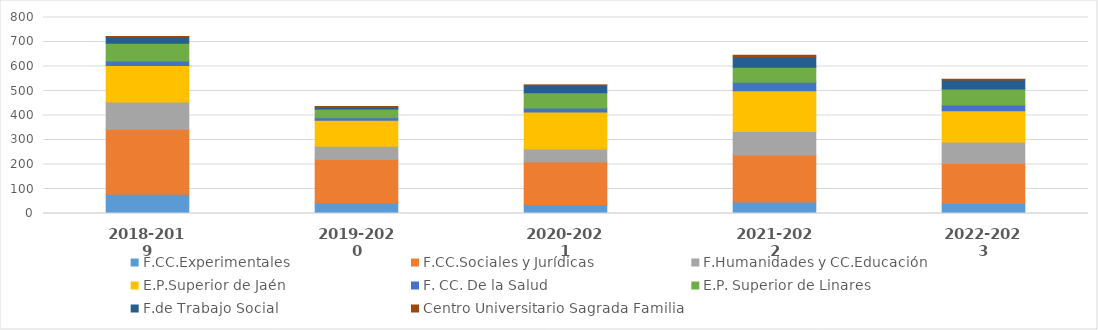
| Category | F.CC.Experimentales | F.CC.Sociales y Jurídicas | F.Humanidades y CC.Educación | E.P.Superior de Jaén | F. CC. De la Salud | E.P. Superior de Linares | F.de Trabajo Social | Centro Universitario Sagrada Familia |
|---|---|---|---|---|---|---|---|---|
| 2018-2019 | 79 | 265 | 111 | 149 | 18 | 73 | 25 | 2 |
| 2019-2020 | 44 | 176 | 54 | 107 | 10 | 36 | 8 | 2 |
| 2020-2021 | 36 | 174 | 53 | 151 | 17 | 62 | 30 | 1 |
| 2021-2022 | 47 | 192 | 96 | 166 | 35 | 61 | 42 | 7 |
| 2022-2023 | 41 | 163 | 88 | 127 | 24 | 65 | 37 | 3 |